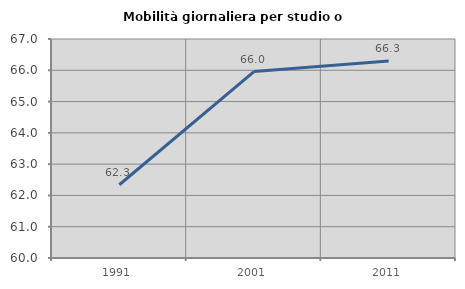
| Category | Mobilità giornaliera per studio o lavoro |
|---|---|
| 1991.0 | 62.341 |
| 2001.0 | 65.959 |
| 2011.0 | 66.294 |